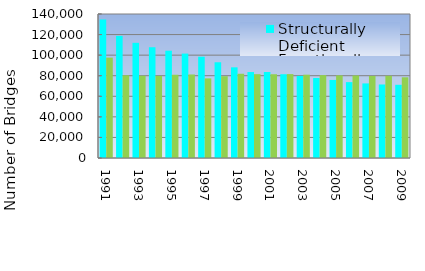
| Category | Structurally Deficient | Functionally Obsolete |
|---|---|---|
| 1991.0 | 134534 | 97593 |
| 1992.0 | 118698 | 80393 |
| 1993.0 | 111980 | 80000 |
| 1994.0 | 107683 | 79832 |
| 1995.0 | 104317 | 80950 |
| 1996.0 | 101518 | 81208 |
| 1997.0 | 98475 | 77410 |
| 1998.0 | 93072 | 79500 |
| 1999.0 | 88150 | 81900 |
| 2000.0 | 83576 | 81510 |
| 2001.0 | 83595 | 81439 |
| 2002.0 | 81437 | 81573 |
| 2003.0 | 79811 | 81008 |
| 2004.0 | 77758 | 80560 |
| 2005.0 | 75871 | 80306 |
| 2006.0 | 73764 | 80226 |
| 2007.0 | 72524 | 79792 |
| 2008.0 | 71469 | 79922 |
| 2009.0 | 71179 | 78468 |